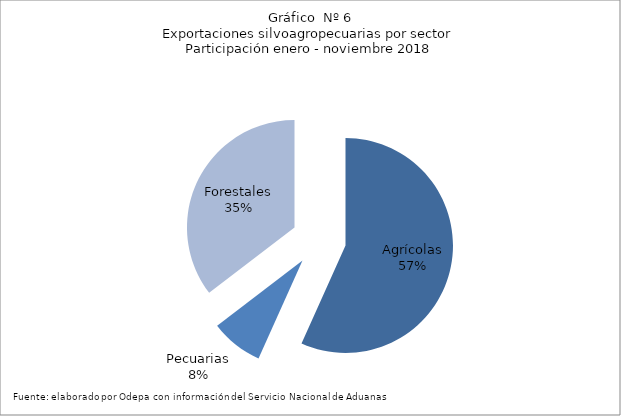
| Category | Series 0 |
|---|---|
| Agrícolas | 9271934 |
| Pecuarias | 1290269 |
| Forestales | 5787680 |